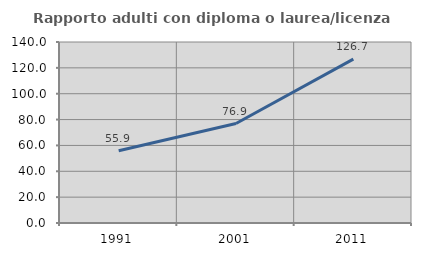
| Category | Rapporto adulti con diploma o laurea/licenza media  |
|---|---|
| 1991.0 | 55.941 |
| 2001.0 | 76.949 |
| 2011.0 | 126.706 |